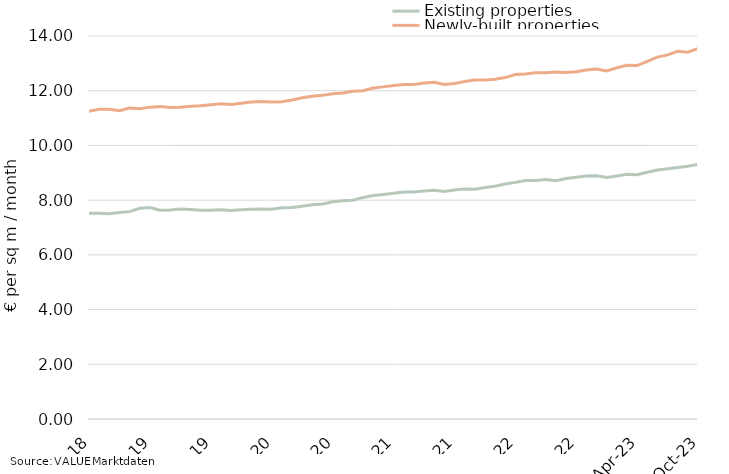
| Category | Existing properties | Newly-built properties |
|---|---|---|
| 2018-10-31 | 7.52 | 11.25 |
| 2018-11-30 | 7.52 | 11.32 |
| 2018-12-31 | 7.5 | 11.32 |
| 2019-01-31 | 7.55 | 11.27 |
| 2019-02-28 | 7.58 | 11.37 |
| 2019-03-31 | 7.7 | 11.34 |
| 2019-04-30 | 7.73 | 11.4 |
| 2019-05-31 | 7.63 | 11.42 |
| 2019-06-30 | 7.64 | 11.39 |
| 2019-07-31 | 7.68 | 11.4 |
| 2019-08-31 | 7.66 | 11.43 |
| 2019-09-30 | 7.63 | 11.45 |
| 2019-10-31 | 7.63 | 11.49 |
| 2019-11-30 | 7.65 | 11.52 |
| 2019-12-31 | 7.62 | 11.5 |
| 2020-01-31 | 7.65 | 11.54 |
| 2020-02-29 | 7.67 | 11.59 |
| 2020-03-31 | 7.68 | 11.61 |
| 2020-04-30 | 7.67 | 11.59 |
| 2020-05-31 | 7.72 | 11.6 |
| 2020-06-30 | 7.73 | 11.66 |
| 2020-07-31 | 7.78 | 11.74 |
| 2020-08-31 | 7.83 | 11.8 |
| 2020-09-30 | 7.86 | 11.83 |
| 2020-10-31 | 7.94 | 11.89 |
| 2020-11-30 | 7.98 | 11.92 |
| 2020-12-31 | 8 | 11.98 |
| 2021-01-31 | 8.1 | 12 |
| 2021-02-28 | 8.17 | 12.1 |
| 2021-03-31 | 8.21 | 12.14 |
| 2021-04-30 | 8.25 | 12.19 |
| 2021-05-31 | 8.3 | 12.23 |
| 2021-06-30 | 8.3 | 12.23 |
| 2021-07-31 | 8.33 | 12.28 |
| 2021-08-31 | 8.36 | 12.31 |
| 2021-09-30 | 8.32 | 12.23 |
| 2021-10-31 | 8.37 | 12.26 |
| 2021-11-30 | 8.41 | 12.34 |
| 2021-12-31 | 8.4 | 12.39 |
| 2022-01-31 | 8.46 | 12.39 |
| 2022-02-28 | 8.51 | 12.42 |
| 2022-03-31 | 8.59 | 12.48 |
| 2022-04-30 | 8.65 | 12.59 |
| 2022-05-31 | 8.72 | 12.61 |
| 2022-06-30 | 8.72 | 12.66 |
| 2022-07-31 | 8.75 | 12.66 |
| 2022-08-31 | 8.71 | 12.68 |
| 2022-09-30 | 8.79 | 12.67 |
| 2022-10-31 | 8.84 | 12.69 |
| 2022-11-30 | 8.88 | 12.76 |
| 2022-12-31 | 8.89 | 12.79 |
| 2023-01-31 | 8.83 | 12.72 |
| 2023-02-28 | 8.88 | 12.84 |
| 2023-03-31 | 8.95 | 12.93 |
| 2023-04-30 | 8.93 | 12.92 |
| 2023-05-31 | 9.02 | 13.07 |
| 2023-06-30 | 9.1 | 13.23 |
| 2023-07-31 | 9.15 | 13.31 |
| 2023-08-31 | 9.19 | 13.44 |
| 2023-09-30 | 9.24 | 13.41 |
| 2023-10-31 | 9.31 | 13.54 |